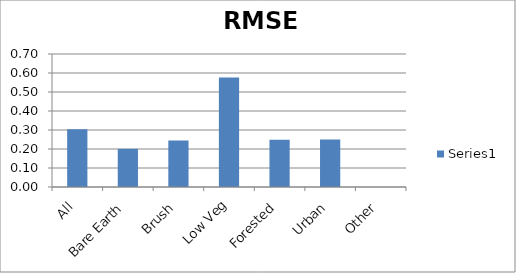
| Category | Series 0 |
|---|---|
| All | 0.304 |
| Bare Earth | 0.2 |
| Brush | 0.245 |
| Low Veg | 0.576 |
| Forested | 0.249 |
| Urban | 0.25 |
| Other | 0 |